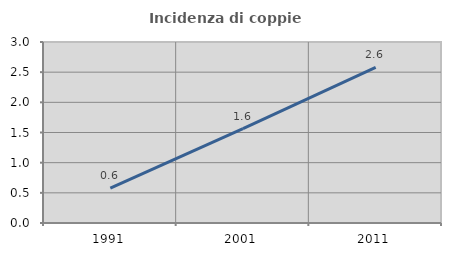
| Category | Incidenza di coppie miste |
|---|---|
| 1991.0 | 0.578 |
| 2001.0 | 1.564 |
| 2011.0 | 2.581 |